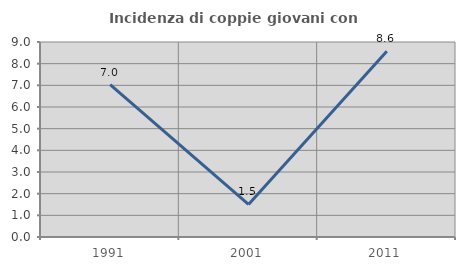
| Category | Incidenza di coppie giovani con figli |
|---|---|
| 1991.0 | 7.031 |
| 2001.0 | 1.504 |
| 2011.0 | 8.571 |